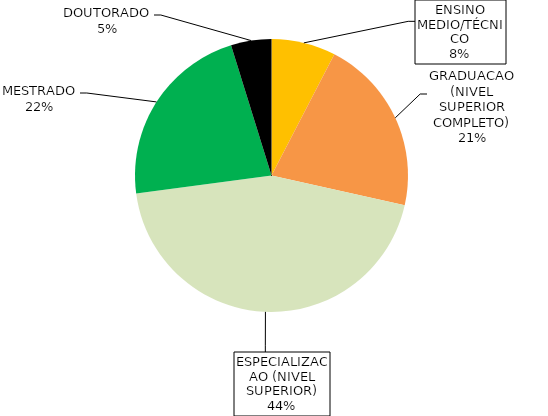
| Category | Series 0 |
|---|---|
| ENSINO MEDIO/TÉCNICO | 0.076 |
| GRADUACAO (NIVEL SUPERIOR COMPLETO) | 0.209 |
| ESPECIALIZACAO (NIVEL SUPERIOR) | 0.444 |
| MESTRADO | 0.223 |
| DOUTORADO | 0.048 |